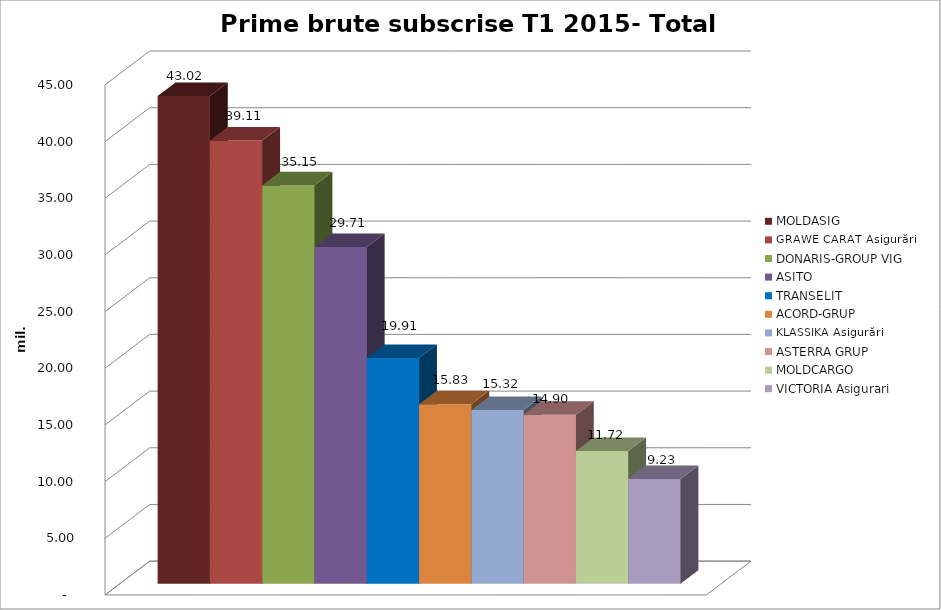
| Category | MOLDASIG  | GRAWE CARAT Asigurări | DONARIS-GROUP VIG | ASITO  | TRANSELIT  | ACORD-GRUP  | KLASSIKA Asigurări  | ASTERRA GRUP  | MOLDCARGO  | VICTORIA Asigurari  |
|---|---|---|---|---|---|---|---|---|---|---|
| 0 | 43.022 | 39.112 | 35.147 | 29.706 | 19.907 | 15.829 | 15.324 | 14.905 | 11.721 | 9.233 |